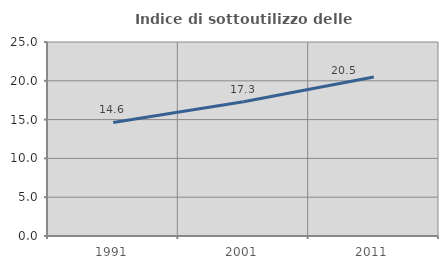
| Category | Indice di sottoutilizzo delle abitazioni  |
|---|---|
| 1991.0 | 14.626 |
| 2001.0 | 17.289 |
| 2011.0 | 20.48 |